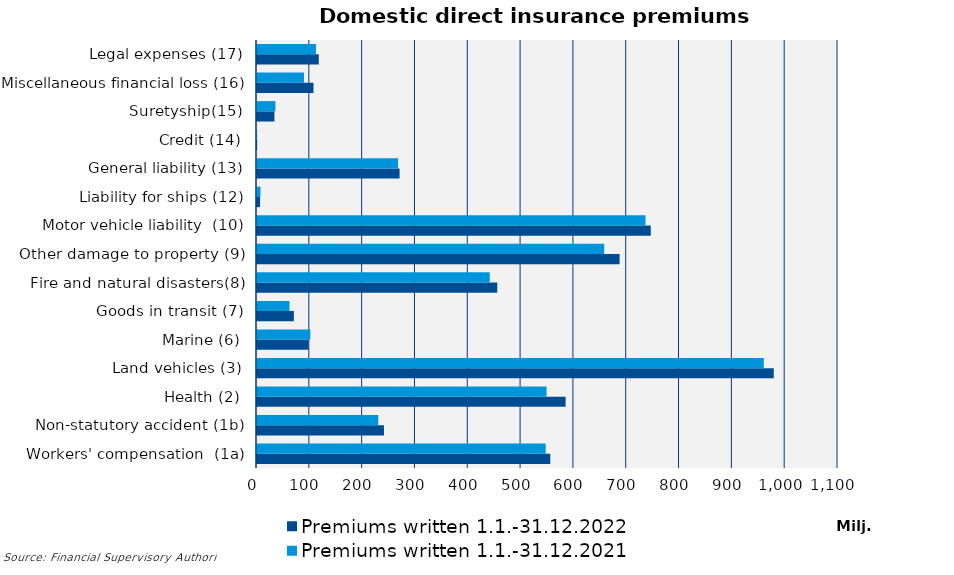
| Category | Premiums written |
|---|---|
| Workers' compensation  (1a) | 546603.494 |
| Non-statutory accident (1b) | 229666.634 |
| Health (2) | 548147.112 |
| Land vehicles (3) | 959533.408 |
| Marine (6) | 100976.853 |
| Goods in transit (7) | 61440.176 |
| Fire and natural disasters(8) | 440706.467 |
| Other damage to property (9) | 657311.877 |
| Motor vehicle liability  (10) | 735547.806 |
| Liability for ships (12) | 6641.662 |
| General liability (13) | 267045.957 |
| Credit (14) | 262.555 |
| Suretyship(15) | 34864.393 |
| Miscellaneous financial loss (16) | 89013.981 |
| Legal expenses (17) | 111682.6 |